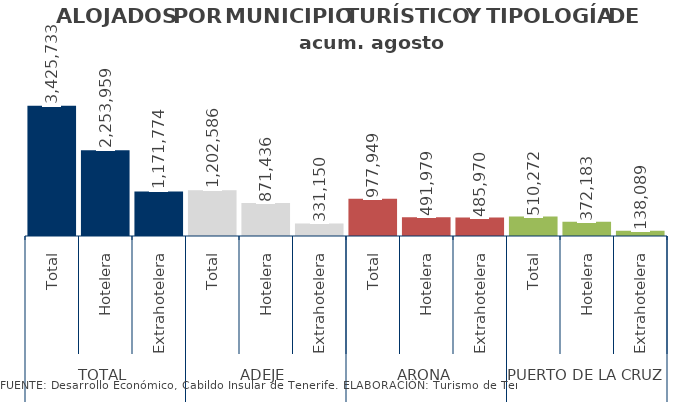
| Category | acum. agosto 2014 |
|---|---|
| 0 | 3425733 |
| 1 | 2253959 |
| 2 | 1171774 |
| 3 | 1202586 |
| 4 | 871436 |
| 5 | 331150 |
| 6 | 977949 |
| 7 | 491979 |
| 8 | 485970 |
| 9 | 510272 |
| 10 | 372183 |
| 11 | 138089 |